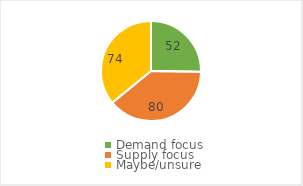
| Category | Series 0 |
|---|---|
| Demand focus | 52 |
| Supply focus | 80 |
| Maybe/unsure | 74 |